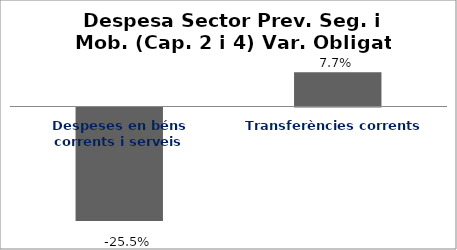
| Category | Series 0 |
|---|---|
| Despeses en béns corrents i serveis | -0.255 |
| Transferències corrents | 0.077 |